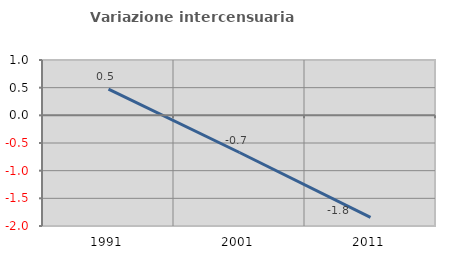
| Category | Variazione intercensuaria annua |
|---|---|
| 1991.0 | 0.474 |
| 2001.0 | -0.672 |
| 2011.0 | -1.843 |